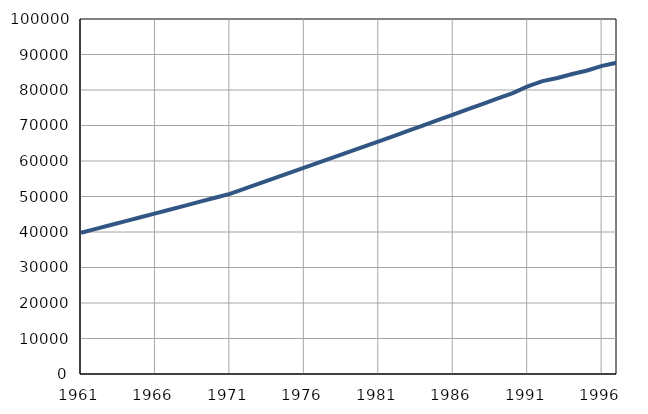
| Category | Population
size |
|---|---|
| 1961.0 | 39779 |
| 1962.0 | 40874 |
| 1963.0 | 41969 |
| 1964.0 | 43064 |
| 1965.0 | 44159 |
| 1966.0 | 45254 |
| 1967.0 | 46349 |
| 1968.0 | 47444 |
| 1969.0 | 48539 |
| 1970.0 | 49634 |
| 1971.0 | 50724 |
| 1972.0 | 52203 |
| 1973.0 | 53682 |
| 1974.0 | 55161 |
| 1975.0 | 56640 |
| 1976.0 | 58119 |
| 1977.0 | 59598 |
| 1978.0 | 61077 |
| 1979.0 | 62556 |
| 1980.0 | 64035 |
| 1981.0 | 65512 |
| 1982.0 | 67025 |
| 1983.0 | 68538 |
| 1984.0 | 70051 |
| 1985.0 | 71564 |
| 1986.0 | 73077 |
| 1987.0 | 74590 |
| 1988.0 | 76103 |
| 1989.0 | 77616 |
| 1990.0 | 79129 |
| 1991.0 | 81000 |
| 1992.0 | 82500 |
| 1993.0 | 83400 |
| 1994.0 | 84500 |
| 1995.0 | 85500 |
| 1996.0 | 86800 |
| 1997.0 | 87700 |